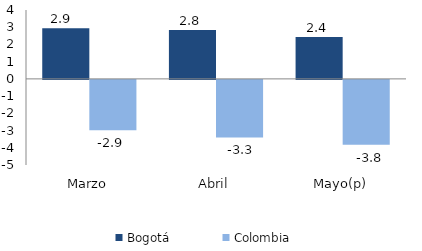
| Category | Bogotá | Colombia |
|---|---|---|
| Marzo | 2.939 | -2.924 |
| Abril | 2.835 | -3.344 |
| Mayo(p) | 2.427 | -3.762 |